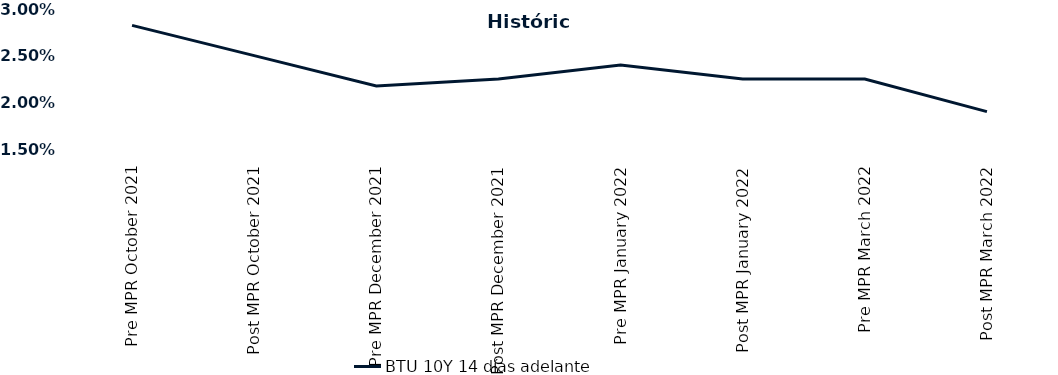
| Category | BTU 10Y 14 días adelante |
|---|---|
| Pre MPR October 2021 | 0.028 |
| Post MPR October 2021 | 0.025 |
| Pre MPR December 2021 | 0.022 |
| Post MPR December 2021 | 0.022 |
| Pre MPR January 2022 | 0.024 |
| Post MPR January 2022 | 0.022 |
| Pre MPR March 2022 | 0.022 |
| Post MPR March 2022 | 0.019 |